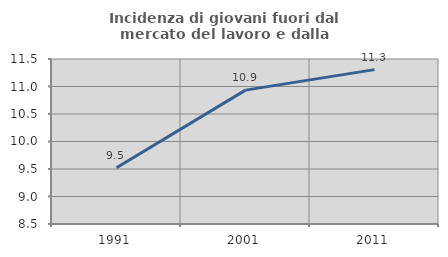
| Category | Incidenza di giovani fuori dal mercato del lavoro e dalla formazione  |
|---|---|
| 1991.0 | 9.524 |
| 2001.0 | 10.934 |
| 2011.0 | 11.307 |